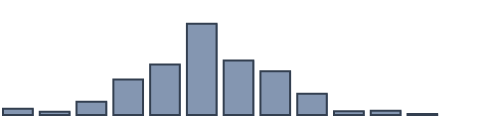
| Category | Series 0 |
|---|---|
| 0 | 1.934 |
| 1 | 1.022 |
| 2 | 4.037 |
| 3 | 10.809 |
| 4 | 15.366 |
| 5 | 27.798 |
| 6 | 16.596 |
| 7 | 13.294 |
| 8 | 6.468 |
| 9 | 1.116 |
| 10 | 1.288 |
| 11 | 0.272 |
| 12 | 0 |